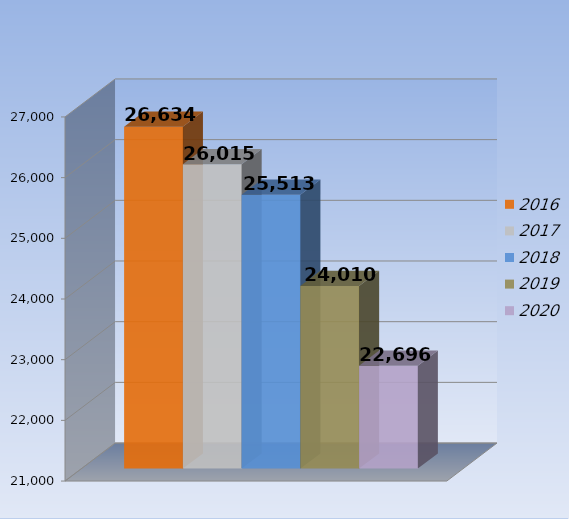
| Category | 2016 | 2017 | 2018 | 2019 | 2020 |
|---|---|---|---|---|---|
| 0 | 26634 | 26015 | 25513 | 24010 | 22696 |